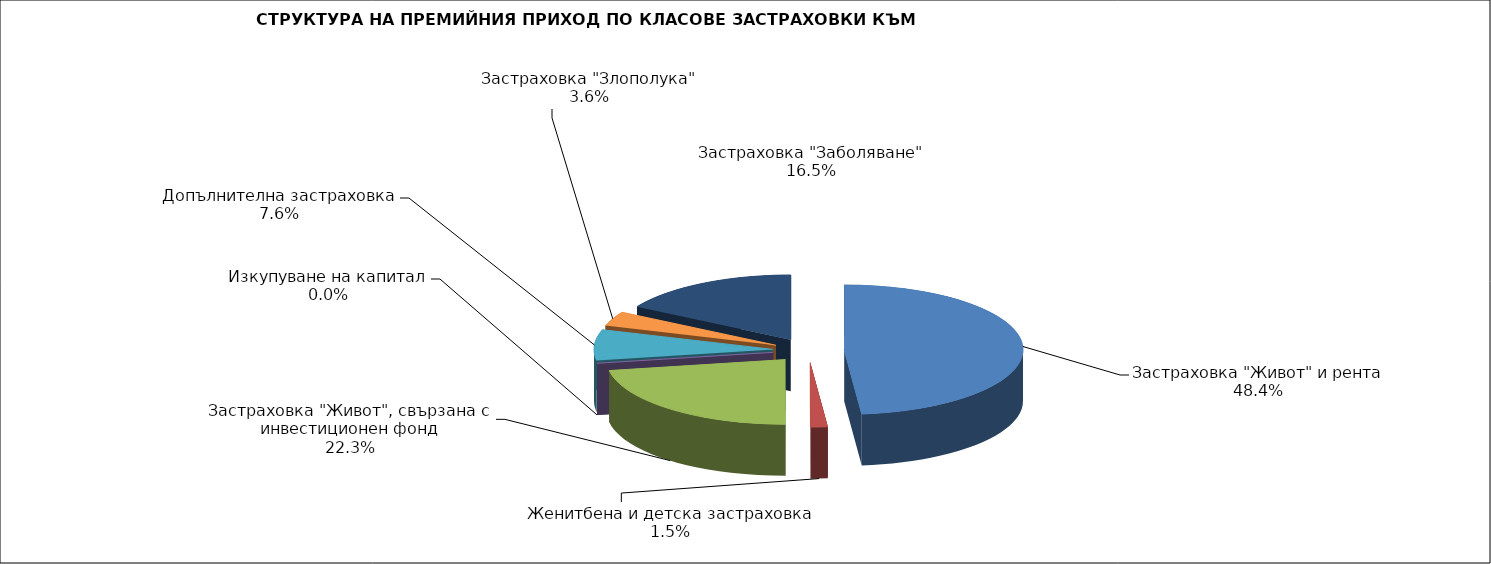
| Category | Series 0 |
|---|---|
| Застраховка "Живот" и рента | 143332993.833 |
| Женитбена и детска застраховка | 4574418.351 |
| Застраховка "Живот", свързана с инвестиционен фонд | 65996988.097 |
| Изкупуване на капитал | 0 |
| Допълнителна застраховка | 22588755.237 |
| Застраховка "Злополука" | 10669923.7 |
| Застраховка "Заболяване" | 48772063.81 |